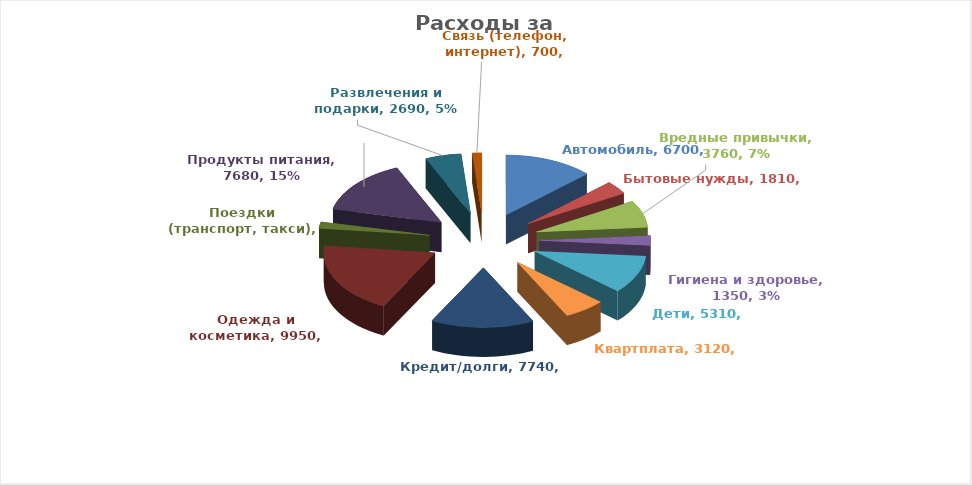
| Category | Series 3 | Series 0 | Series 1 | Series 2 |
|---|---|---|---|---|
| Автомобиль | 6700 |  |  | 6700 |
| Бытовые нужды | 1810 |  |  | 1810 |
| Вредные привычки | 3760 |  |  | 3760 |
| Гигиена и здоровье | 1350 |  |  | 1350 |
| Дети | 5310 |  |  | 5310 |
| Квартплата | 3120 |  |  | 3120 |
| Кредит/долги | 7740 |  |  | 7740 |
| Одежда и косметика | 9950 |  |  | 9950 |
| Поездки (транспорт, такси) | 890 |  |  | 890 |
| Продукты питания | 7680 |  |  | 7680 |
| Развлечения и подарки | 2690 |  |  | 2690 |
| Связь (телефон, интернет) | 700 |  |  | 700 |